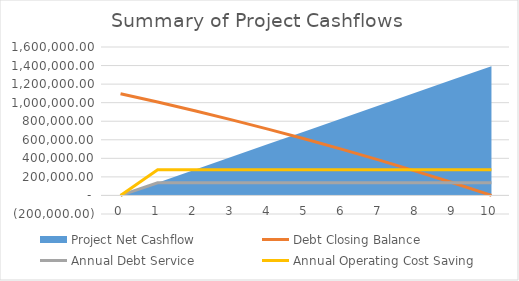
| Category | Debt Closing Balance | Annual Debt Service | Annual Operating Cost Saving |
|---|---|---|---|
| 0.0 | 1096638.202 | 0 | 0 |
| 1.0 | 1006351.845 | 136893.48 | 276544.1 |
| 2.0 | 912228.318 | 136893.48 | 276544.1 |
| 3.0 | 814104.542 | 136893.48 | 276544.1 |
| 4.0 | 711810.505 | 136893.48 | 276544.1 |
| 5.0 | 605168.971 | 136893.48 | 276544.1 |
| 6.0 | 493995.172 | 136893.48 | 276544.1 |
| 7.0 | 378096.486 | 136893.48 | 276544.1 |
| 8.0 | 257272.107 | 136893.48 | 276544.1 |
| 9.0 | 131312.691 | 136893.48 | 276544.1 |
| 10.0 | 0 | 136893.48 | 276544.1 |